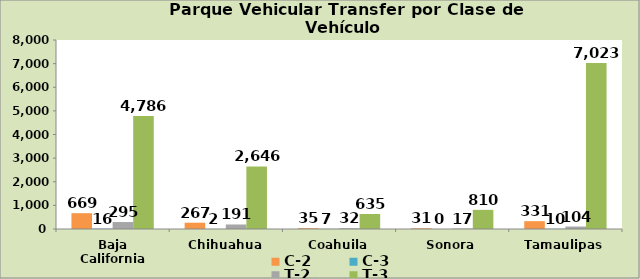
| Category | C-2 | C-3 | T-2 | T-3 |
|---|---|---|---|---|
| Baja California | 669 | 16 | 295 | 4786 |
| Chihuahua | 267 | 2 | 191 | 2646 |
| Coahuila | 35 | 7 | 32 | 635 |
| Sonora | 31 | 0 | 17 | 810 |
| Tamaulipas | 331 | 10 | 104 | 7023 |